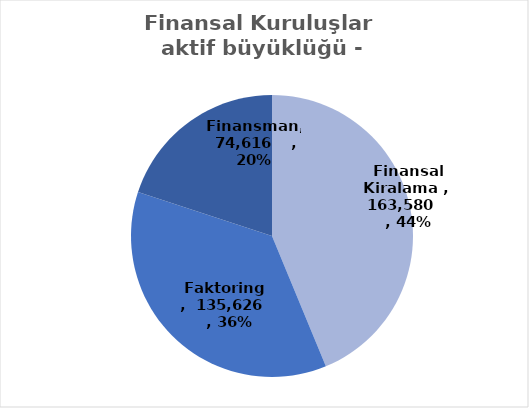
| Category | Series 0 |
|---|---|
| Finansal Kiralama  | 163580 |
| Faktoring  | 135626 |
| Finansman | 74616 |